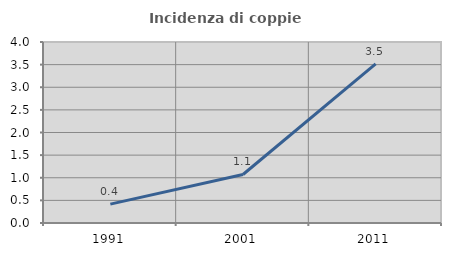
| Category | Incidenza di coppie miste |
|---|---|
| 1991.0 | 0.418 |
| 2001.0 | 1.072 |
| 2011.0 | 3.516 |